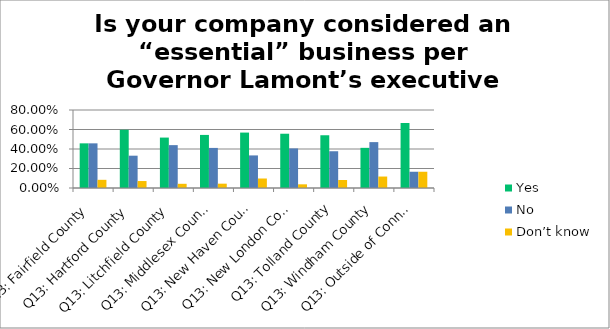
| Category | Yes | No | Don’t know |
|---|---|---|---|
| Q13: Fairfield County | 0.458 | 0.458 | 0.084 |
| Q13: Hartford County | 0.597 | 0.331 | 0.071 |
| Q13: Litchfield County | 0.517 | 0.44 | 0.043 |
| Q13: Middlesex County | 0.544 | 0.411 | 0.044 |
| Q13: New Haven County | 0.568 | 0.334 | 0.097 |
| Q13: New London County | 0.557 | 0.406 | 0.038 |
| Q13: Tolland County | 0.541 | 0.377 | 0.082 |
| Q13: Windham County | 0.412 | 0.471 | 0.118 |
| Q13: Outside of Connecticut | 0.667 | 0.167 | 0.167 |